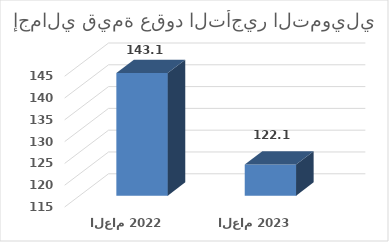
| Category | Series 0 |
|---|---|
| العام 2022 | 143141843 |
| العام 2023 | 122157516 |